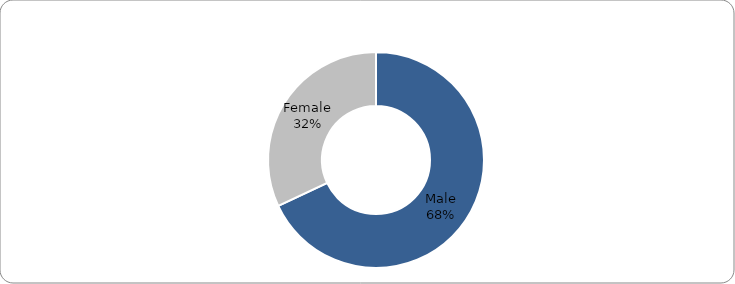
| Category | Series 0 |
|---|---|
| Male | 68.015 |
| Female | 31.985 |